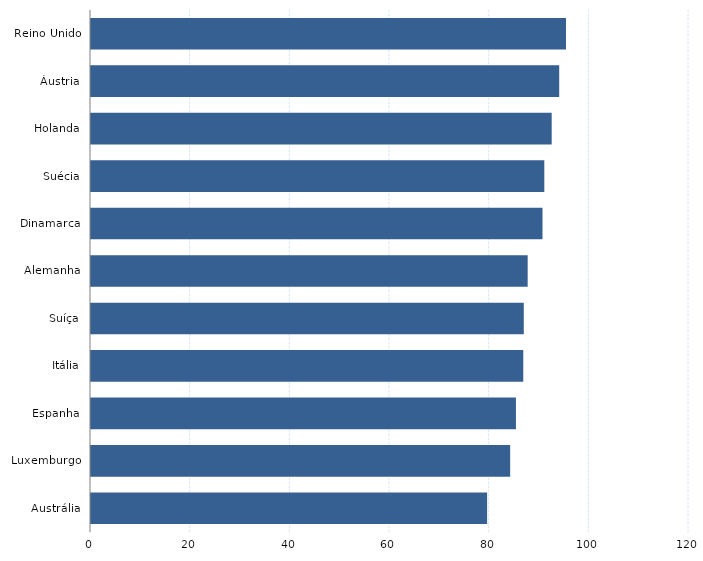
| Category | Series 0 |
|---|---|
| Austrália | 79.487 |
| Luxemburgo | 84.114 |
| Espanha | 85.273 |
| Itália | 86.742 |
| Suíça | 86.847 |
| Alemanha | 87.628 |
| Dinamarca | 90.599 |
| Suécia | 90.966 |
| Holanda | 92.447 |
| Áustria | 93.955 |
| Reino Unido | 95.319 |